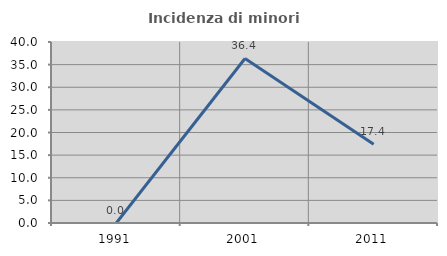
| Category | Incidenza di minori stranieri |
|---|---|
| 1991.0 | 0 |
| 2001.0 | 36.364 |
| 2011.0 | 17.391 |